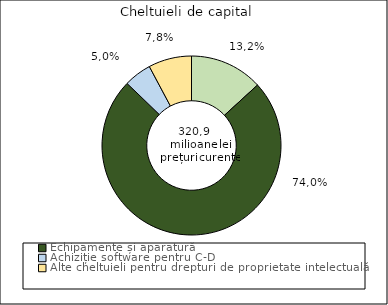
| Category | Series 0 |
|---|---|
| Terenuri și construcții | 0.132 |
| Echipamente și aparatură | 0.74 |
| Achiziție software pentru C-D | 0.05 |
| Alte cheltuieli pentru drepturi de proprietate intelectuală | 0.078 |